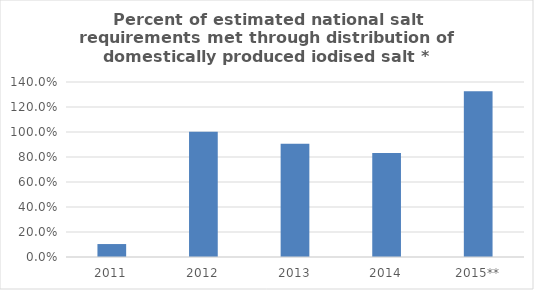
| Category | % of demand met with iodised salt* |
|---|---|
| 2011 | 0.104 |
| 2012 | 1.002 |
| 2013 | 0.907 |
| 2014 | 0.832 |
| 2015** | 1.326 |